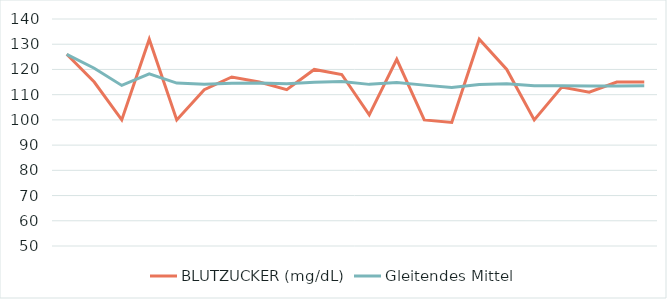
| Category | BLUTZUCKER (mg/dL) | Gleitendes Mittel |
|---|---|---|
| 0 | 126 | 126 |
| 1 | 115 | 120.5 |
| 2 | 100 | 113.667 |
| 3 | 132 | 118.25 |
| 4 | 100 | 114.6 |
| 5 | 112 | 114.167 |
| 6 | 117 | 114.571 |
| 7 | 115 | 114.625 |
| 8 | 112 | 114.333 |
| 9 | 120 | 114.9 |
| 10 | 118 | 115.182 |
| 11 | 102 | 114.083 |
| 12 | 124 | 114.846 |
| 13 | 100 | 113.786 |
| 14 | 99 | 112.8 |
| 15 | 132 | 114 |
| 16 | 120 | 114.353 |
| 17 | 100 | 113.556 |
| 18 | 113 | 113.526 |
| 19 | 111 | 113.4 |
| 20 | 115 | 113.476 |
| 21 | 115 | 113.545 |